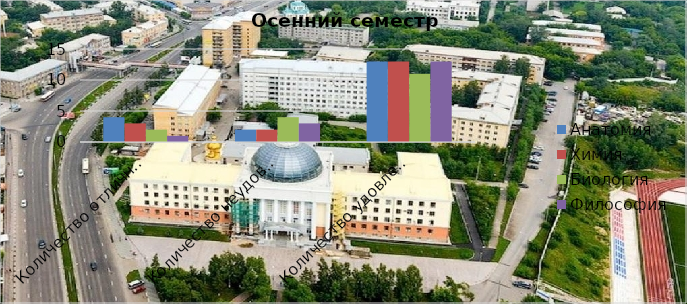
| Category | Анатомия | Химия | Биология | Философия |
|---|---|---|---|---|
| Количество отличных отметок | 4 | 3 | 2 | 1 |
| Количество неудовлетворительных отметок | 2 | 2 | 4 | 3 |
| Количество удовлетворительных отметок | 13 | 13 | 11 | 13 |